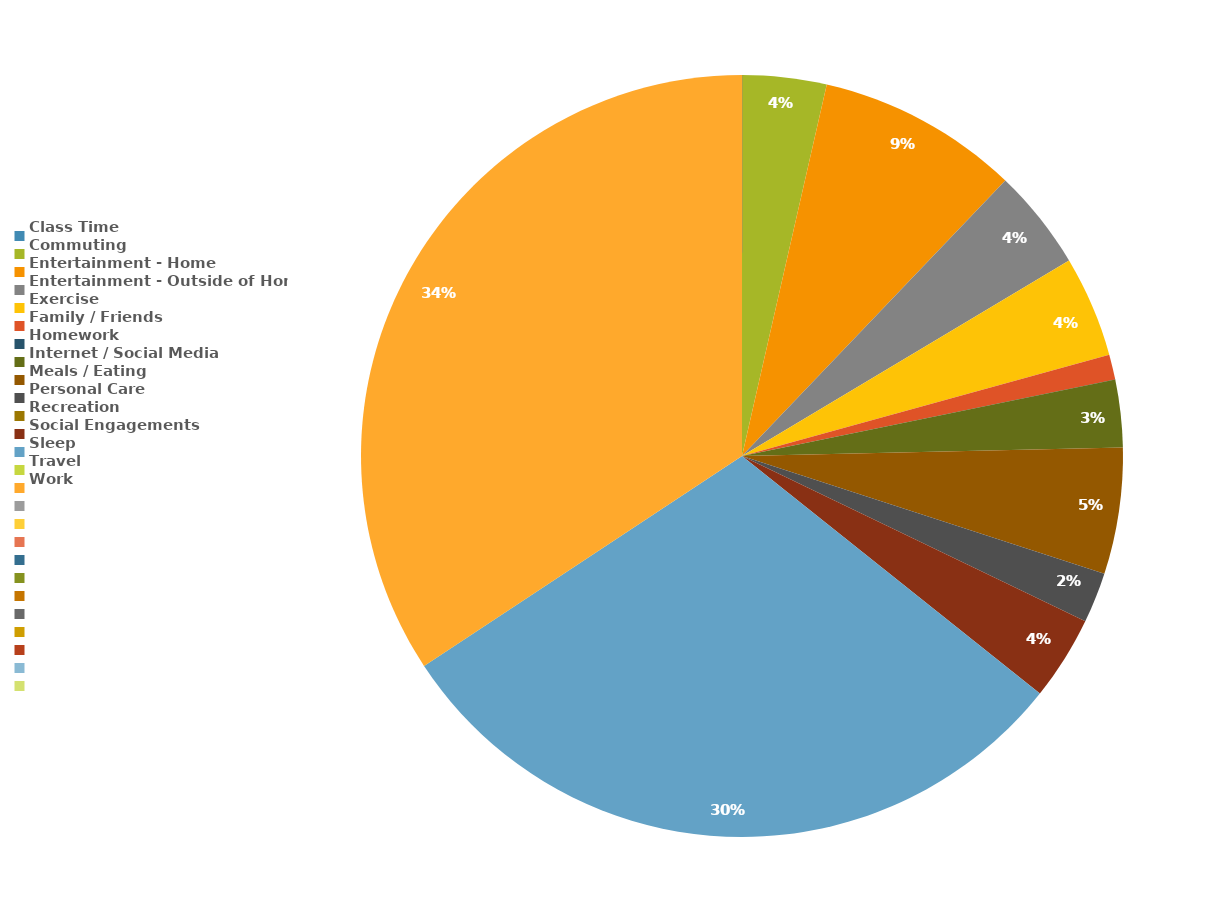
| Category | WEEKLY TOTALS 
IN MINS |
|---|---|
| Class Time | 0 |
| Commuting | 50 |
| Entertainment - Home | 120 |
| Entertainment - Outside of Home | 60 |
| Exercise | 60 |
| Family / Friends | 15 |
| Homework | 0 |
| Internet / Social Media | 40 |
| Meals / Eating | 75 |
| Personal Care | 30 |
| Recreation | 0 |
| Social Engagements | 50 |
| Sleep | 420 |
| Travel | 0 |
| Work | 480 |